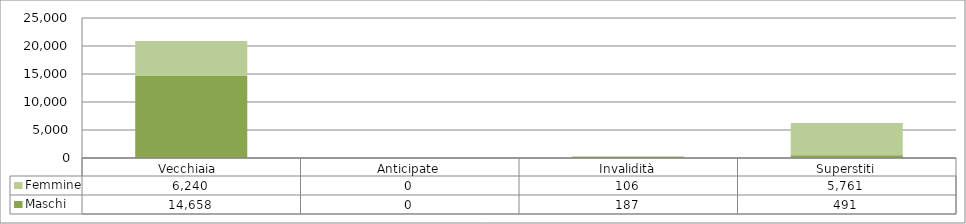
| Category | Maschi | Femmine |
|---|---|---|
| Vecchiaia  | 14658 | 6240 |
| Anticipate | 0 | 0 |
| Invalidità | 187 | 106 |
| Superstiti | 491 | 5761 |